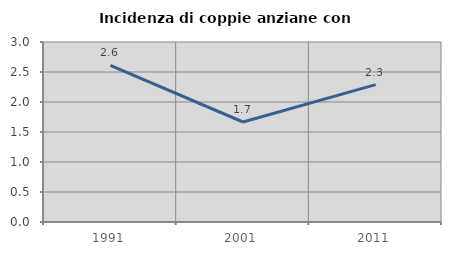
| Category | Incidenza di coppie anziane con figli |
|---|---|
| 1991.0 | 2.609 |
| 2001.0 | 1.667 |
| 2011.0 | 2.29 |